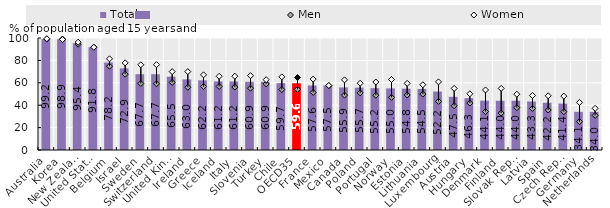
| Category | Total |
|---|---|
| Australia | 99.2 |
| Korea | 98.9 |
| New Zealand | 95.4 |
| United States | 91.8 |
| Belgium | 78.2 |
| Israel | 72.9 |
| Sweden | 67.7 |
| Switzerland | 67.7 |
| United Kingdom | 65.5 |
| Ireland | 63 |
| Greece | 62.2 |
| Iceland | 61.2 |
| Italy | 61.2 |
| Slovenia | 60.9 |
| Turkey | 60.9 |
| Chile | 59.7 |
| OECD35 | 59.6 |
| France | 57.6 |
| Mexico | 57.5 |
| Canada | 55.9 |
| Poland | 55.7 |
| Portugal | 55.2 |
| Norway | 55 |
| Estonia | 54.8 |
| Lithuania | 54.5 |
| Luxembourg | 52.2 |
| Austria | 47.5 |
| Hungary | 46.3 |
| Denmark | 44.1 |
| Finland | 44 |
| Slovak Republic | 44 |
| Latvia | 43.3 |
| Spain | 42.2 |
| Czech Republic | 41.4 |
| Germany | 34.1 |
| Netherlands | 34 |